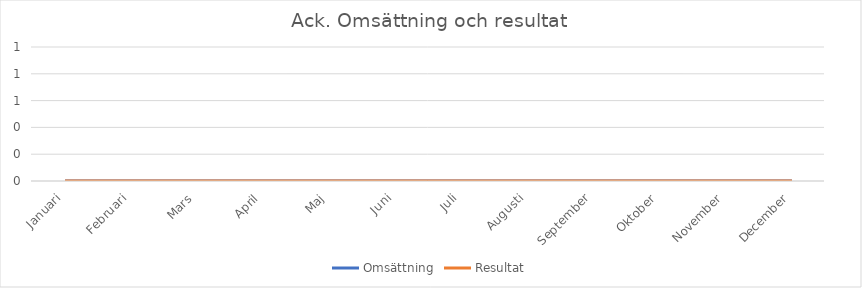
| Category | Omsättning | Resultat |
|---|---|---|
| Januari | 0 | 0 |
| Februari | 0 | 0 |
| Mars | 0 | 0 |
| April | 0 | 0 |
| Maj | 0 | 0 |
| Juni | 0 | 0 |
| Juli | 0 | 0 |
| Augusti | 0 | 0 |
| September | 0 | 0 |
| Oktober | 0 | 0 |
| November | 0 | 0 |
| December | 0 | 0 |